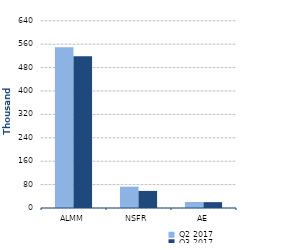
| Category | Q2 2017 | Q3 2017 |
|---|---|---|
| 0 | 549331 | 519001 |
| 1/1/00 | 72992 | 58455 |
| 1/2/00 | 20430 | 20010 |